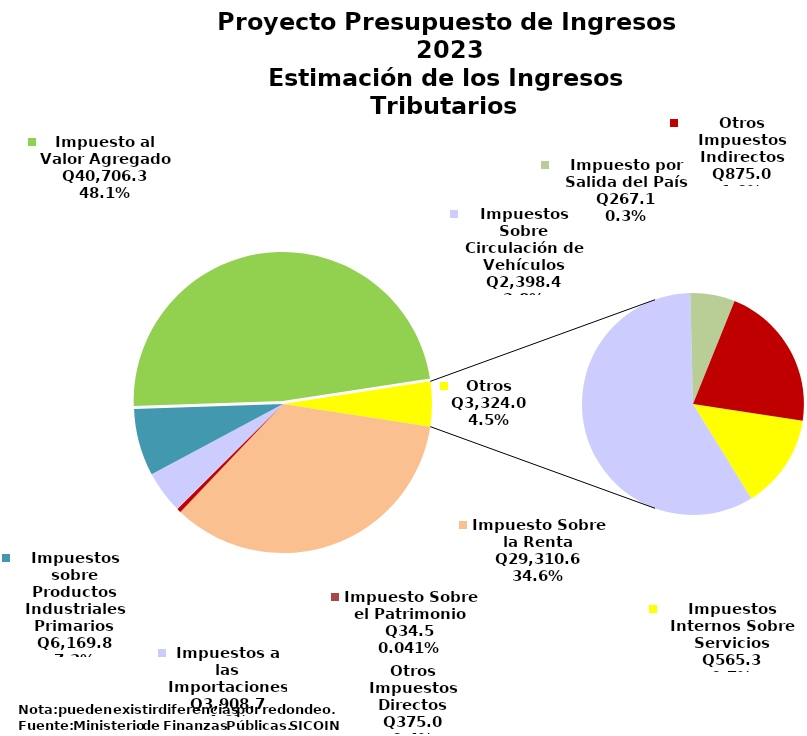
| Category | Series 0 |
|---|---|
| Impuesto Sobre la Renta | 29310.6 |
| Impuesto Sobre el Patrimonio | 34.5 |
| Otros Impuestos Directos | 375 |
| Impuestos a las Importaciones | 3908.7 |
| Impuestos sobre Productos Industriales Primarios | 6169.8 |
| Impuesto al Valor Agregado | 40706.3 |
| Impuestos Internos Sobre Servicios | 565.3 |
| Impuestos Sobre Circulación de Vehículos | 2398.4 |
| Impuesto por Salida del País | 267.1 |
| Otros Impuestos Indirectos | 875 |